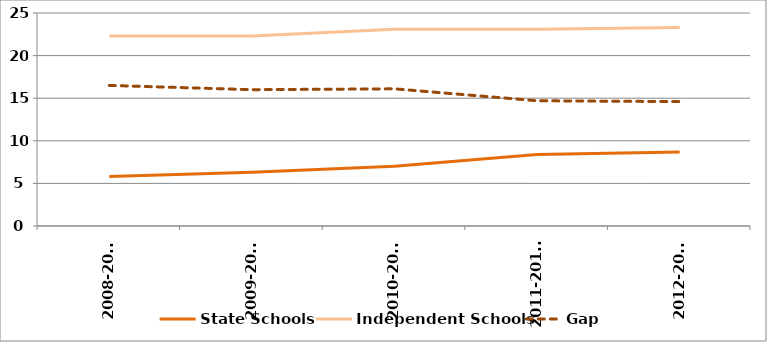
| Category | State Schools | Independent Schools | Gap |
|---|---|---|---|
| 2008-2009 | 5.8 | 22.3 | 16.5 |
| 2009-2010 | 6.3 | 22.3 | 16 |
| 2010-2011 | 7 | 23.1 | 16.1 |
| 2011-2012r | 8.4 | 23.1 | 14.7 |
| 2012-2013 | 8.7 | 23.3 | 14.6 |